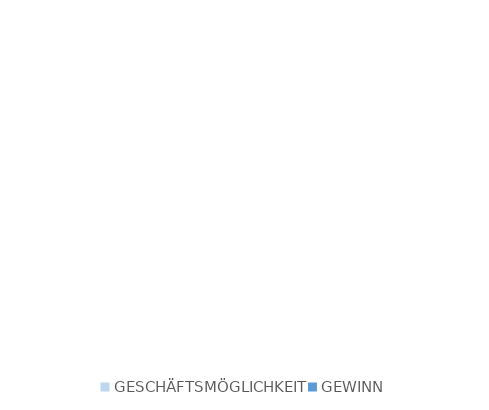
| Category | Series 0 |
|---|---|
| GESCHÄFTSMÖGLICHKEIT | 0 |
| GEWINN | 0 |